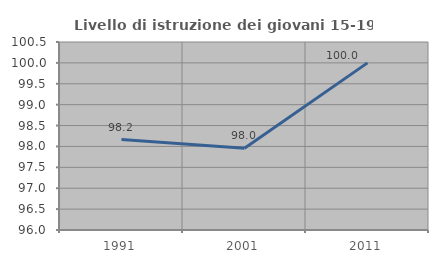
| Category | Livello di istruzione dei giovani 15-19 anni |
|---|---|
| 1991.0 | 98.165 |
| 2001.0 | 97.959 |
| 2011.0 | 100 |